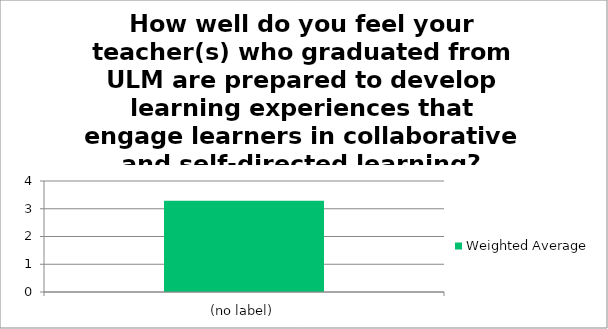
| Category | Weighted Average |
|---|---|
| (no label) | 3.29 |